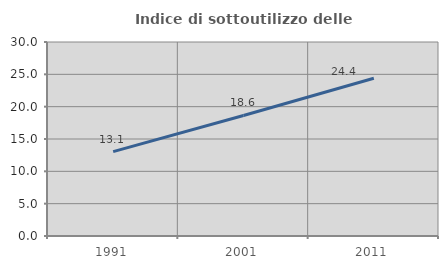
| Category | Indice di sottoutilizzo delle abitazioni  |
|---|---|
| 1991.0 | 13.052 |
| 2001.0 | 18.64 |
| 2011.0 | 24.386 |